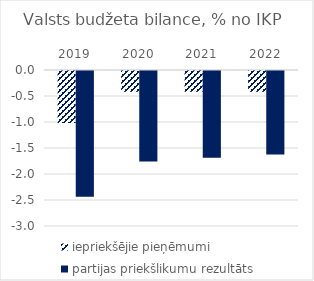
| Category | iepriekšējie pieņēmumi | partijas priekšlikumu rezultāts |
|---|---|---|
| 2019.0 | -1 | -2.416 |
| 2020.0 | -0.4 | -1.739 |
| 2021.0 | -0.4 | -1.67 |
| 2022.0 | -0.4 | -1.605 |